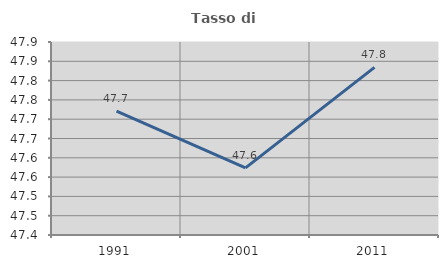
| Category | Tasso di occupazione   |
|---|---|
| 1991.0 | 47.721 |
| 2001.0 | 47.574 |
| 2011.0 | 47.834 |